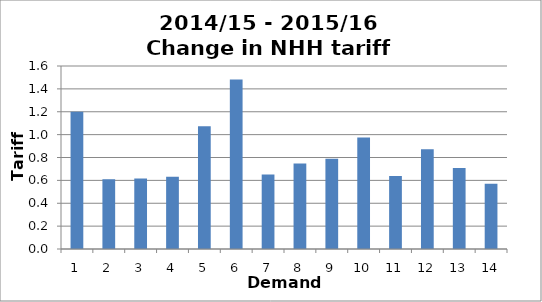
| Category | Series 1 |
|---|---|
| 0 | 1.199 |
| 1 | 0.609 |
| 2 | 0.617 |
| 3 | 0.631 |
| 4 | 1.073 |
| 5 | 1.483 |
| 6 | 0.651 |
| 7 | 0.748 |
| 8 | 0.789 |
| 9 | 0.975 |
| 10 | 0.638 |
| 11 | 0.872 |
| 12 | 0.708 |
| 13 | 0.57 |